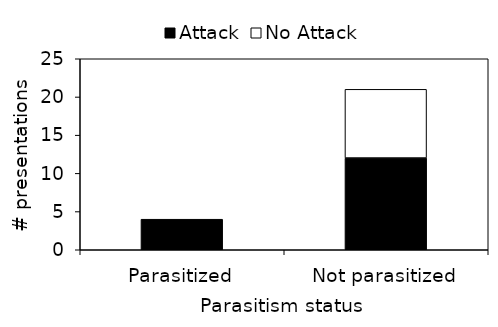
| Category | Attack | No Attack |
|---|---|---|
| Parasitized | 4 | 0 |
| Not parasitized | 12 | 9 |